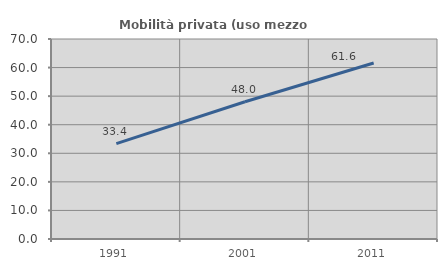
| Category | Mobilità privata (uso mezzo privato) |
|---|---|
| 1991.0 | 33.382 |
| 2001.0 | 48.036 |
| 2011.0 | 61.581 |